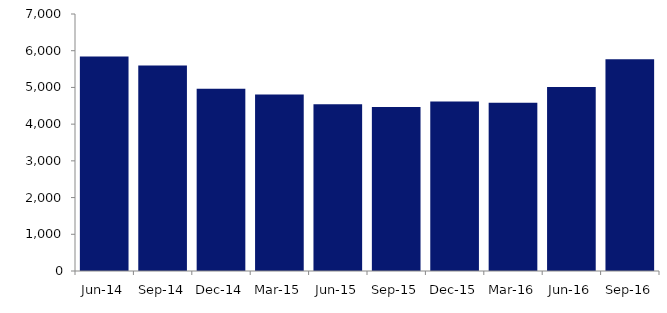
| Category | Series 0 |
|---|---|
| Jun-14 | 5840 |
| Sep-14 | 5599 |
| Dec-14 | 4964 |
| Mar-15 | 4808 |
| Jun-15 | 4541 |
| Sep-15 | 4467 |
| Dec-15 | 4619 |
| Mar-16 | 4585 |
| Jun-16 | 5012 |
| Sep-16 | 5770 |